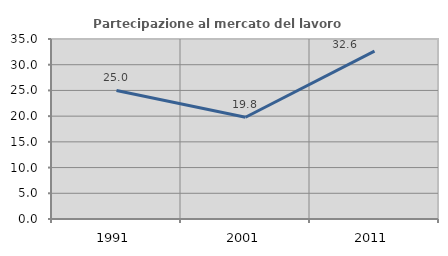
| Category | Partecipazione al mercato del lavoro  femminile |
|---|---|
| 1991.0 | 25 |
| 2001.0 | 19.783 |
| 2011.0 | 32.635 |